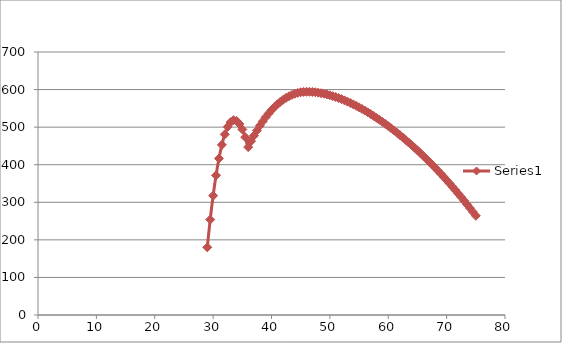
| Category | Series 1 |
|---|---|
| 75.0 | 264.1 |
| 74.5 | 274.345 |
| 74.0 | 284.412 |
| 73.5 | 294.305 |
| 73.0 | 304.026 |
| 72.5 | 313.578 |
| 72.0 | 322.964 |
| 71.5 | 332.186 |
| 71.0 | 341.248 |
| 70.5 | 350.15 |
| 70.0 | 358.896 |
| 69.5 | 367.487 |
| 69.0 | 375.925 |
| 68.5 | 384.212 |
| 68.0 | 392.349 |
| 67.5 | 400.338 |
| 67.0 | 408.179 |
| 66.5 | 415.875 |
| 66.0 | 423.425 |
| 65.5 | 430.831 |
| 65.0 | 438.093 |
| 64.5 | 445.211 |
| 64.0 | 452.187 |
| 63.5 | 459.02 |
| 63.0 | 465.71 |
| 62.5 | 472.257 |
| 62.0 | 478.661 |
| 61.5 | 484.921 |
| 61.0 | 491.037 |
| 60.5 | 497.007 |
| 60.0 | 502.832 |
| 59.5 | 508.508 |
| 59.0 | 514.037 |
| 58.5 | 519.414 |
| 58.0 | 524.639 |
| 57.5 | 529.71 |
| 57.0 | 534.624 |
| 56.5 | 539.379 |
| 56.0 | 543.972 |
| 55.5 | 548.399 |
| 55.0 | 552.658 |
| 54.5 | 556.745 |
| 54.0 | 560.655 |
| 53.5 | 564.384 |
| 53.0 | 567.928 |
| 52.5 | 571.281 |
| 52.0 | 574.438 |
| 51.5 | 577.392 |
| 51.0 | 580.137 |
| 50.5 | 582.666 |
| 50.0 | 584.972 |
| 49.5 | 587.046 |
| 49.0 | 588.878 |
| 48.5 | 590.461 |
| 48.0 | 591.782 |
| 47.5 | 592.832 |
| 47.0 | 593.597 |
| 46.5 | 594.065 |
| 46.0 | 594.201 |
| 45.5 | 593.791 |
| 45.0 | 592.769 |
| 44.5 | 591.121 |
| 44.0 | 588.83 |
| 43.5 | 585.878 |
| 43.0 | 582.248 |
| 42.5 | 577.92 |
| 42.0 | 572.874 |
| 41.5 | 567.087 |
| 41.0 | 560.537 |
| 40.5 | 553.199 |
| 40.0 | 545.047 |
| 39.5 | 536.054 |
| 39.0 | 526.191 |
| 38.5 | 515.426 |
| 38.0 | 503.728 |
| 37.5 | 491.062 |
| 37.0 | 477.39 |
| 36.5 | 462.674 |
| 36.0 | 446.873 |
| 35.5 | 473.234 |
| 35.0 | 493.942 |
| 34.5 | 508.561 |
| 34.0 | 516.837 |
| 33.5 | 518.498 |
| 33.0 | 513.252 |
| 32.5 | 500.787 |
| 32.0 | 480.77 |
| 31.5 | 452.845 |
| 31.0 | 416.628 |
| 30.5 | 371.709 |
| 30.0 | 317.65 |
| 29.5 | 253.976 |
| 29.0 | 180.181 |